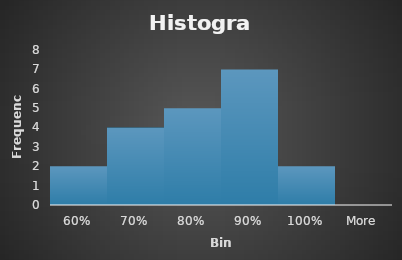
| Category | Frequency |
|---|---|
| 60% | 2 |
| 70% | 4 |
| 80% | 5 |
| 90% | 7 |
| 100% | 2 |
| More | 0 |